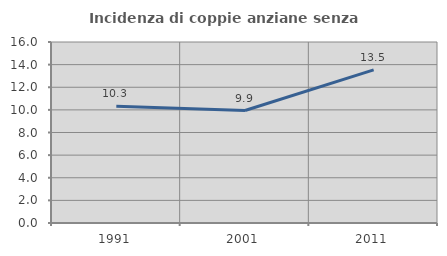
| Category | Incidenza di coppie anziane senza figli  |
|---|---|
| 1991.0 | 10.313 |
| 2001.0 | 9.944 |
| 2011.0 | 13.531 |